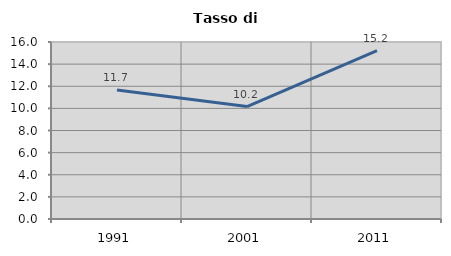
| Category | Tasso di disoccupazione   |
|---|---|
| 1991.0 | 11.654 |
| 2001.0 | 10.166 |
| 2011.0 | 15.217 |